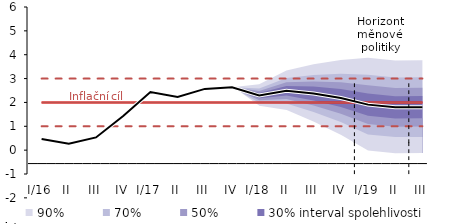
| Category | Inflation Target | Inflation Target - lower bound | Inflation Target - upper bound | linka | Střed předpovědi |
|---|---|---|---|---|---|
| I/16 | 2 | 1 | 3 | 0.467 | 0.467 |
| II | 2 | 1 | 3 | 0.267 | 0.267 |
| III | 2 | 1 | 3 | 0.533 | 0.533 |
| IV | 2 | 1 | 3 | 1.433 | 1.433 |
| I/17 | 2 | 1 | 3 | 2.433 | 2.433 |
| II | 2 | 1 | 3 | 2.233 | 2.233 |
| III | 2 | 1 | 3 | 2.567 | 2.567 |
| IV | 2 | 1 | 3 | 2.633 | 2.633 |
| I/18 | 2 | 1 | 3 | 2.288 | 2.288 |
| II | 2 | 1 | 3 | 2.491 | 2.491 |
| III | 2 | 1 | 3 | 2.376 | 2.376 |
| IV | 2 | 1 | 3 | 2.187 | 2.187 |
| I/19 | 2 | 1 | 3 | 1.908 | 1.908 |
| II | 2 | 1 | 3 | 1.794 | 1.794 |
| III | 2 | 1 | 3 | 1.803 | 1.803 |